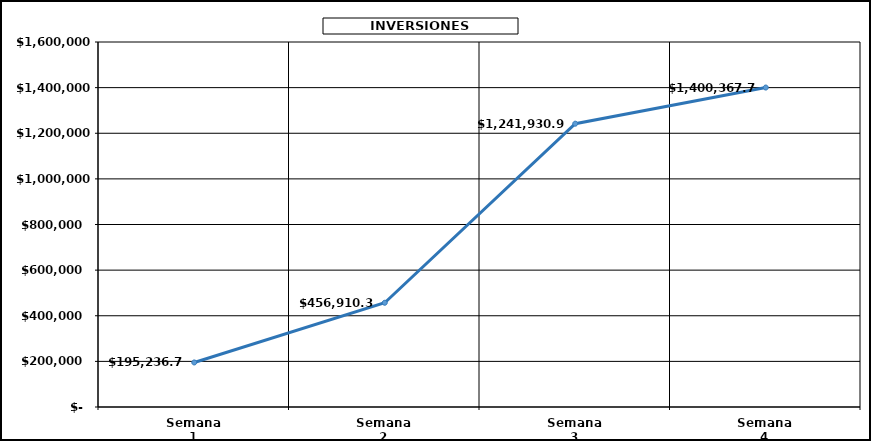
| Category | Series 0 |
|---|---|
| Semana 1 | 195236.773 |
| Semana 2 | 456910.32 |
| Semana 3 | 1241930.961 |
| Semana 4 | 1400367.735 |